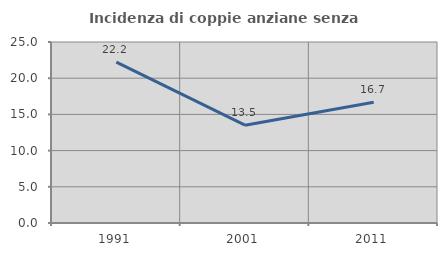
| Category | Incidenza di coppie anziane senza figli  |
|---|---|
| 1991.0 | 22.222 |
| 2001.0 | 13.514 |
| 2011.0 | 16.667 |